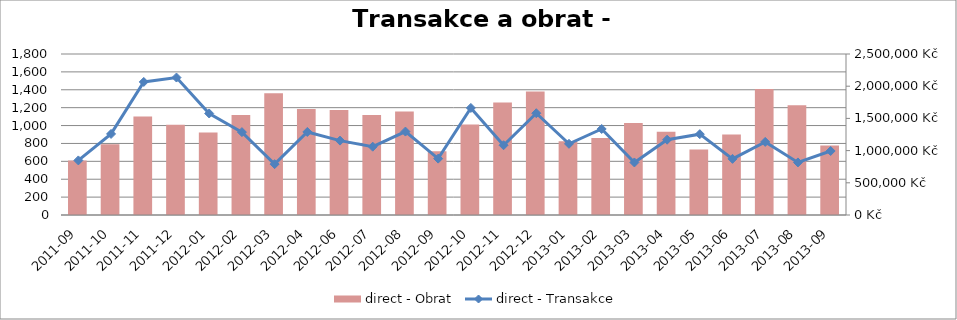
| Category | direct - Obrat |
|---|---|
| 2011-09 | 847458.259 |
| 2011-10 | 1097963.686 |
| 2011-11 | 1530514.653 |
| 2011-12 | 1402372.099 |
| 2012-01 | 1282931.223 |
| 2012-02 | 1551517.864 |
| 2012-03 | 1892207.596 |
| 2012-04 | 1646781.006 |
| 2012-06 | 1631867.123 |
| 2012-07 | 1552038.766 |
| 2012-08 | 1605412.984 |
| 2012-09 | 989773.303 |
| 2012-10 | 1403955.187 |
| 2012-11 | 1747658.619 |
| 2012-12 | 1917909.911 |
| 2013-01 | 1143788.215 |
| 2013-02 | 1193783.906 |
| 2013-03 | 1430259.984 |
| 2013-04 | 1291373.265 |
| 2013-05 | 1017360.161 |
| 2013-06 | 1248265.321 |
| 2013-07 | 1956408.935 |
| 2013-08 | 1705849.337 |
| 2013-09 | 1079425.153 |